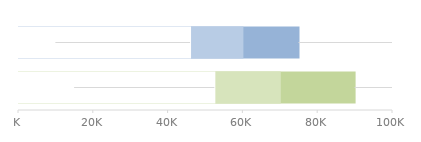
| Category | 75% | 50% | 25% |
|---|---|---|---|
| 0 | 75000 | 60000 | 46000 |
| 1 | 90000 | 70000 | 52500 |